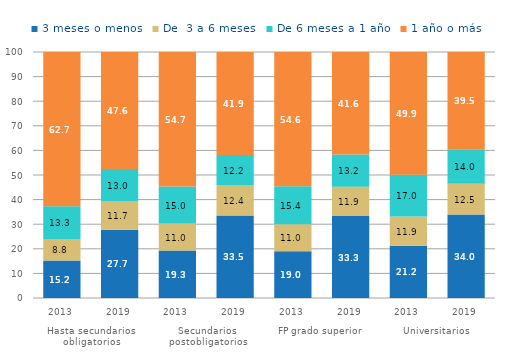
| Category | 3 meses o menos | De  3 a 6 meses | De 6 meses a 1 año | 1 año o más |
|---|---|---|---|---|
| 0 | 15.249 | 8.751 | 13.266 | 62.734 |
| 1 | 27.704 | 11.731 | 12.957 | 47.608 |
| 2 | 19.317 | 10.958 | 15.034 | 54.692 |
| 3 | 33.487 | 12.419 | 12.184 | 41.909 |
| 4 | 18.98 | 10.995 | 15.43 | 54.595 |
| 5 | 33.317 | 11.863 | 13.175 | 41.645 |
| 6 | 21.237 | 11.905 | 16.973 | 49.885 |
| 7 | 33.98 | 12.469 | 14.032 | 39.519 |